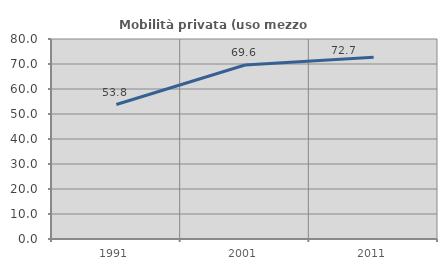
| Category | Mobilità privata (uso mezzo privato) |
|---|---|
| 1991.0 | 53.789 |
| 2001.0 | 69.604 |
| 2011.0 | 72.674 |